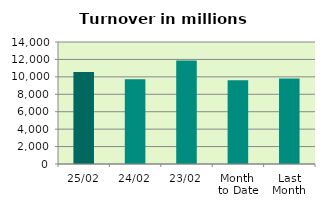
| Category | Series 0 |
|---|---|
| 25/02 | 10564.763 |
| 24/02 | 9737.15 |
| 23/02 | 11878.012 |
| Month 
to Date | 9600.006 |
| Last
Month | 9809.456 |